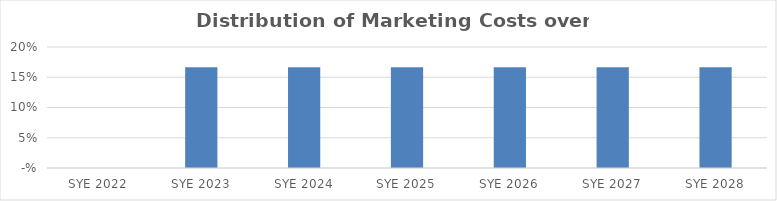
| Category | Series 0 |
|---|---|
| 2022.0 | 0 |
| 2023.0 | 0.167 |
| 2024.0 | 0.167 |
| 2025.0 | 0.167 |
| 2026.0 | 0.167 |
| 2027.0 | 0.167 |
| 2028.0 | 0.167 |